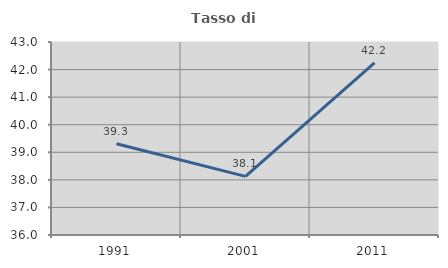
| Category | Tasso di occupazione   |
|---|---|
| 1991.0 | 39.308 |
| 2001.0 | 38.127 |
| 2011.0 | 42.246 |